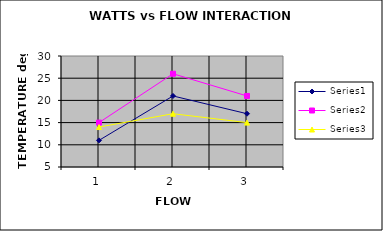
| Category | Series 0 | Series 1 | Series 2 |
|---|---|---|---|
| 0 | 11 | 15 | 14 |
| 1 | 21 | 26 | 17 |
| 2 | 17 | 21 | 15 |